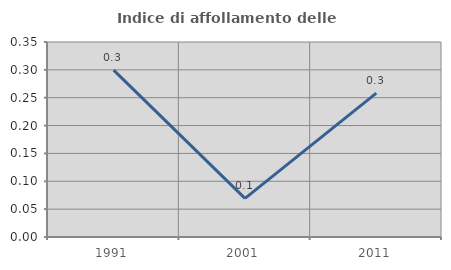
| Category | Indice di affollamento delle abitazioni  |
|---|---|
| 1991.0 | 0.299 |
| 2001.0 | 0.069 |
| 2011.0 | 0.258 |